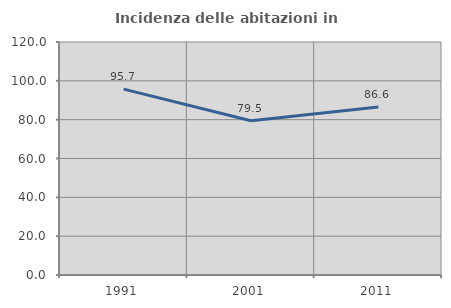
| Category | Incidenza delle abitazioni in proprietà  |
|---|---|
| 1991.0 | 95.745 |
| 2001.0 | 79.464 |
| 2011.0 | 86.567 |